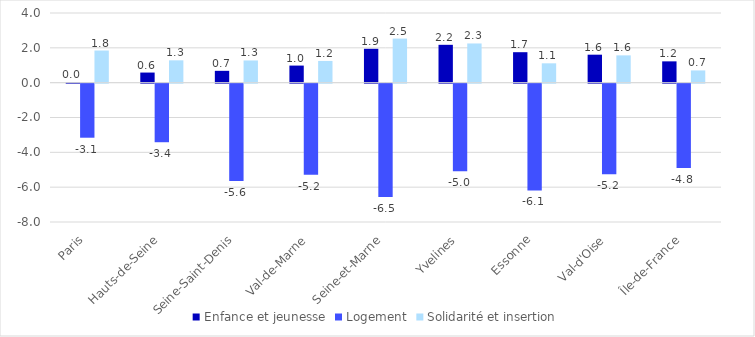
| Category | Enfance et jeunesse | Logement | Solidarité et insertion |
|---|---|---|---|
| Paris | 0.016 | -3.103 | 1.845 |
| Hauts-de-Seine | 0.581 | -3.362 | 1.282 |
| Seine-Saint-Denis | 0.679 | -5.592 | 1.275 |
| Val-de-Marne | 0.981 | -5.235 | 1.247 |
| Seine-et-Marne | 1.945 | -6.504 | 2.531 |
| Yvelines | 2.173 | -5.034 | 2.251 |
| Essonne | 1.75 | -6.127 | 1.111 |
| Val-d'Oise | 1.607 | -5.199 | 1.567 |
| Île-de-France | 1.224 | -4.835 | 0.702 |